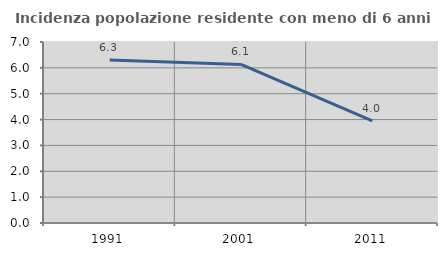
| Category | Incidenza popolazione residente con meno di 6 anni |
|---|---|
| 1991.0 | 6.308 |
| 2001.0 | 6.131 |
| 2011.0 | 3.953 |